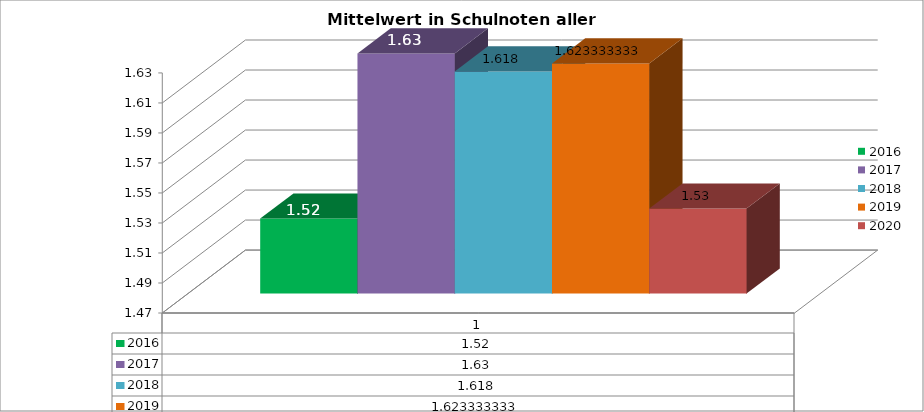
| Category | 2016 | 2017 | 2018 | 2019 | 2020 |
|---|---|---|---|---|---|
| 0 | 1.52 | 1.63 | 1.618 | 1.623 | 1.527 |